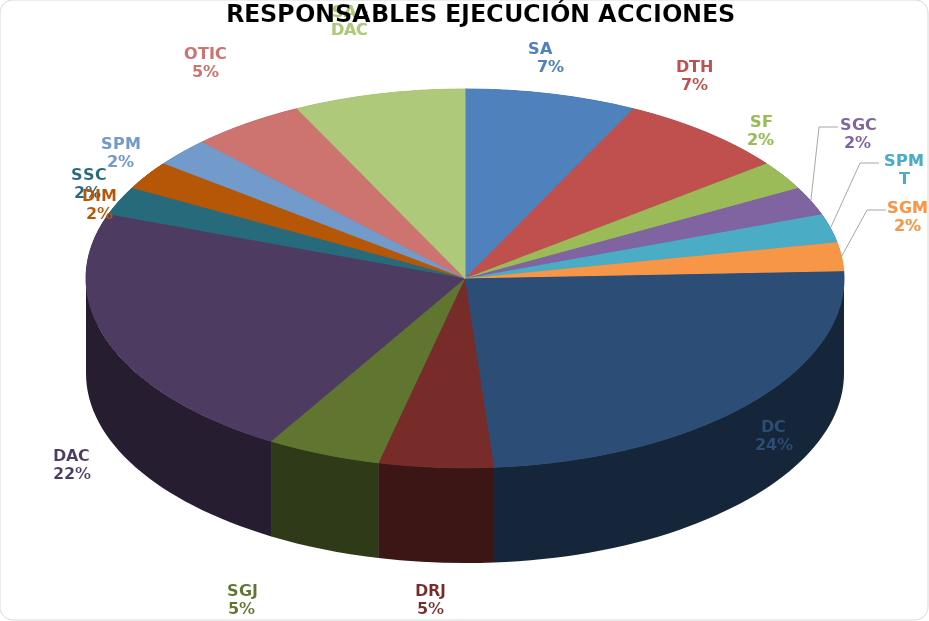
| Category | Series 0 |
|---|---|
| SA     | 3 |
| DTH | 3 |
| SF | 1 |
| SGC | 1 |
| SPMT | 1 |
| SGM | 1 |
| DC | 10 |
| DRJ | 2 |
| SGJ | 2 |
| DAC | 9 |
| SSC | 1 |
| DIM | 1 |
| SPM | 1 |
| OTIC | 2 |
| SA - DAC | 3 |